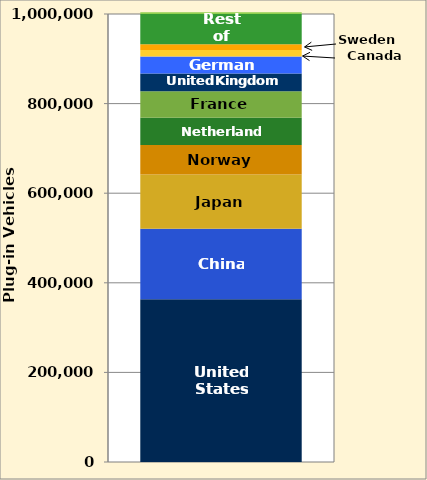
| Category | United States | China | Japan | Norway | Netherlands | France | United Kingdom | Germany | Canada | Sweden | Rest of World | Series 11 |
|---|---|---|---|---|---|---|---|---|---|---|---|---|
| 0 | 363265 | 157354 | 121000 | 65958 | 61025 | 59000 | 39616 | 38154 | 14429 | 12786 | 71413 | 0.362 |